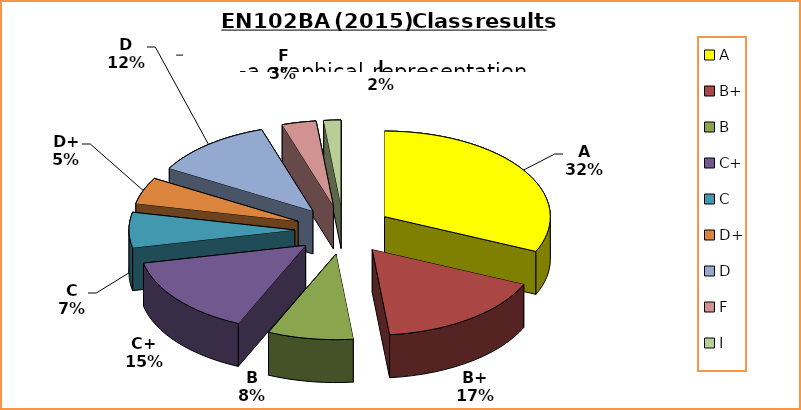
| Category | Series 0 |
|---|---|
| A | 19 |
| B+ | 10 |
| B | 5 |
| C+ | 9 |
| C | 4 |
| D+ | 3 |
| D | 7 |
| F | 2 |
| I | 1 |